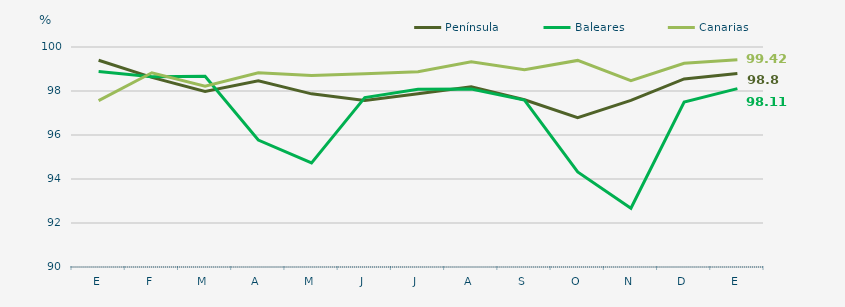
| Category | Península | Baleares | Canarias |
|---|---|---|---|
| E | 99.4 | 98.89 | 97.56 |
| F | 98.62 | 98.65 | 98.83 |
| M | 97.98 | 98.67 | 98.22 |
| A | 98.46 | 95.77 | 98.83 |
| M | 97.87 | 94.73 | 98.7 |
| J | 97.57 | 97.7 | 98.78 |
| J | 97.87 | 98.08 | 98.88 |
| A | 98.19 | 98.09 | 99.33 |
| S | 97.6 | 97.59 | 98.97 |
| O | 96.79 | 94.32 | 99.39 |
| N | 97.57 | 92.67 | 98.47 |
| D | 98.55 | 97.5 | 99.26 |
| E | 98.8 | 98.11 | 99.42 |